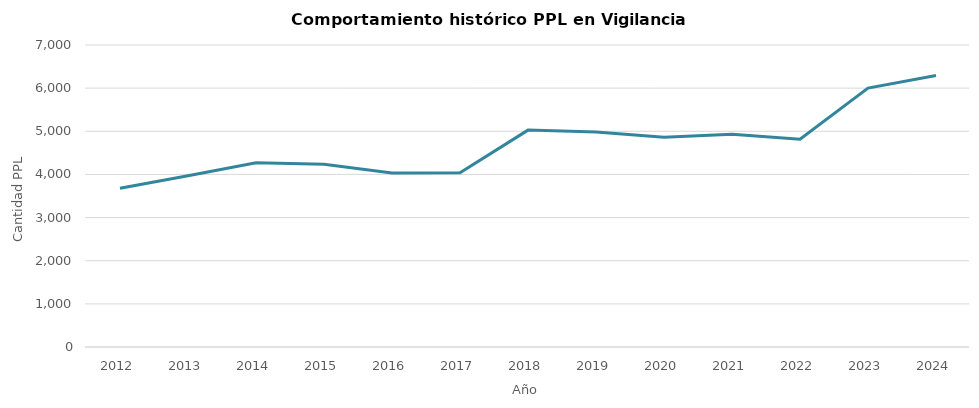
| Category | Promedio anual Vigilancia Electronica |
|---|---|
| 2012.0 | 3681.25 |
| 2013.0 | 3969.167 |
| 2014.0 | 4270.833 |
| 2015.0 | 4235.667 |
| 2016.0 | 4035.917 |
| 2017.0 | 4037.5 |
| 2018.0 | 5027.25 |
| 2019.0 | 4984.25 |
| 2020.0 | 4861 |
| 2021.0 | 4932.083 |
| 2022.0 | 4814.083 |
| 2023.0 | 6001.5 |
| 2024.0 | 6293.2 |